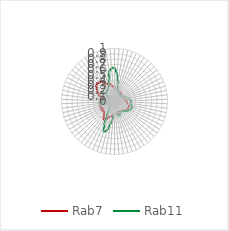
| Category | Rab7 | Rab11 |
|---|---|---|
| 0.0 | 0.267 | 0.64 |
| 0.10913 | 0.224 | 0.531 |
| 0.21825 | 0.215 | 0.375 |
| 0.32738 | 0.222 | 0.251 |
| 0.43651 | 0.203 | 0.202 |
| 0.54563 | 0.197 | 0.18 |
| 0.65476 | 0.215 | 0.165 |
| 0.76389 | 0.187 | 0.16 |
| 0.87302 | 0.198 | 0.164 |
| 0.98214 | 0.18 | 0.159 |
| 1.09127 | 0.181 | 0.148 |
| 1.2004 | 0.172 | 0.16 |
| 1.30952 | 0.172 | 0.179 |
| 1.41865 | 0.184 | 0.198 |
| 1.52778 | 0.193 | 0.221 |
| 1.6369 | 0.175 | 0.25 |
| 1.74603 | 0.184 | 0.272 |
| 1.85516 | 0.207 | 0.288 |
| 1.96429 | 0.233 | 0.312 |
| 2.07341 | 0.231 | 0.315 |
| 2.18254 | 0.244 | 0.315 |
| 2.29167 | 0.265 | 0.329 |
| 2.40079 | 0.286 | 0.349 |
| 2.50992 | 0.292 | 0.348 |
| 2.61905 | 0.287 | 0.336 |
| 2.72817 | 0.291 | 0.317 |
| 2.8373 | 0.265 | 0.307 |
| 2.94643 | 0.259 | 0.268 |
| 3.05556 | 0.243 | 0.246 |
| 3.16468 | 0.22 | 0.23 |
| 3.27381 | 0.214 | 0.23 |
| 3.38294 | 0.207 | 0.228 |
| 3.49206 | 0.205 | 0.259 |
| 3.60119 | 0.212 | 0.281 |
| 3.71032 | 0.238 | 0.265 |
| 3.81944 | 0.216 | 0.237 |
| 3.92857 | 0.233 | 0.227 |
| 4.0377 | 0.221 | 0.234 |
| 4.14683 | 0.239 | 0.293 |
| 4.25595 | 0.277 | 0.421 |
| 4.36508 | 0.288 | 0.565 |
| 4.47421 | 0.311 | 0.605 |
| 4.58333 | 0.364 | 0.465 |
| 4.69246 | 0.395 | 0.29 |
| 4.80159 | 0.368 | 0.187 |
| 4.91071 | 0.314 | 0.144 |
| 5.01984 | 0.279 | 0.12 |
| 5.12897 | 0.268 | 0.099 |
| 5.2381 | 0.287 | 0.088 |
| 5.34722 | 0.248 | 0.09 |
| 5.45635 | 0.293 | 0.088 |
| 5.56548 | 0.279 | 0.113 |
| 5.6746 | 0.27 | 0.166 |
| 5.78373 | 0.27 | 0.253 |
| 5.89286 | 0.288 | 0.291 |
| 6.00198 | 0.269 | 0.24 |
| 6.11111 | 0.258 | 0.155 |
| 6.22024 | 0.231 | 0.113 |
| 6.32937 | 0.237 | 0.087 |
| 6.43849 | 0.235 | 0.083 |
| 6.54762 | 0.318 | 0.098 |
| 6.65675 | 0.343 | 0.106 |
| 6.76587 | 0.383 | 0.132 |
| 6.875 | 0.42 | 0.17 |
| 6.98413 | 0.461 | 0.202 |
| 7.09325 | 0.467 | 0.234 |
| 7.20238 | 0.457 | 0.236 |
| 7.31151 | 0.453 | 0.25 |
| 7.42063 | 0.419 | 0.266 |
| 7.52976 | 0.356 | 0.276 |
| 7.63889 | 0.353 | 0.322 |
| 7.74802 | 0.349 | 0.427 |
| 7.85714 | 0.3 | 0.578 |
| 7.96627 | 0.276 | 0.635 |